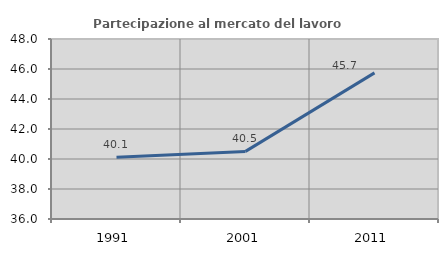
| Category | Partecipazione al mercato del lavoro  femminile |
|---|---|
| 1991.0 | 40.111 |
| 2001.0 | 40.507 |
| 2011.0 | 45.742 |